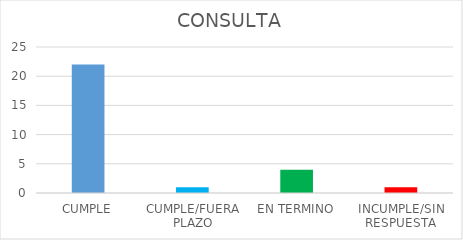
| Category | TOTAL |
|---|---|
| CUMPLE | 22 |
| CUMPLE/FUERA PLAZO | 1 |
| EN TERMINO | 4 |
| INCUMPLE/SIN RESPUESTA | 1 |